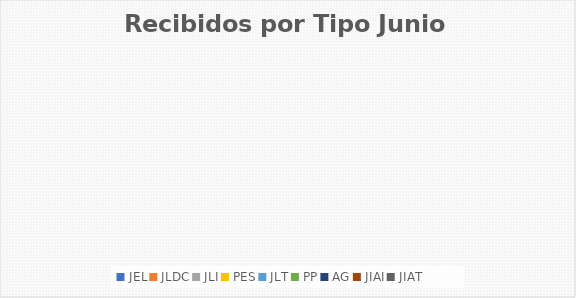
| Category | Series 0 |
|---|---|
| JEL | 0 |
| JLDC | 0 |
| JLI | 0 |
| PES | 0 |
| JLT | 0 |
| PP | 0 |
| AG | 0 |
| JIAI | 0 |
| JIAT | 0 |